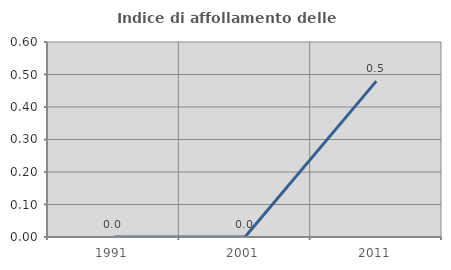
| Category | Indice di affollamento delle abitazioni  |
|---|---|
| 1991.0 | 0 |
| 2001.0 | 0 |
| 2011.0 | 0.48 |